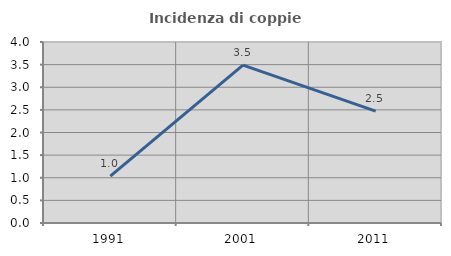
| Category | Incidenza di coppie miste |
|---|---|
| 1991.0 | 1.037 |
| 2001.0 | 3.491 |
| 2011.0 | 2.472 |